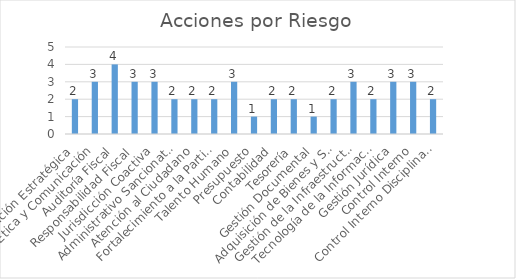
| Category | Series 0 |
|---|---|
| Planeación Estratégica | 2 |
| Ética y Comunicación | 3 |
| Auditoría Fiscal | 4 |
| Responsabilidad Fiscal | 3 |
| Jurisdicción Coactiva | 3 |
| Administrativo Sancionatorio | 2 |
| Atención al Ciudadano | 2 |
| Fortalecimiento a la Participación Ciudadana | 2 |
| Talento Humano | 3 |
| Presupuesto | 1 |
| Contabilidad | 2 |
| Tesorería | 2 |
| Gestión Documental | 1 |
| Adquisición de Bienes y Servicios | 2 |
| Gestión de la Infraestructura | 3 |
| Tecnología de la Información | 2 |
| Gestión Jurídica | 3 |
| Control Interno | 3 |
| Control Interno Disciplinario | 2 |